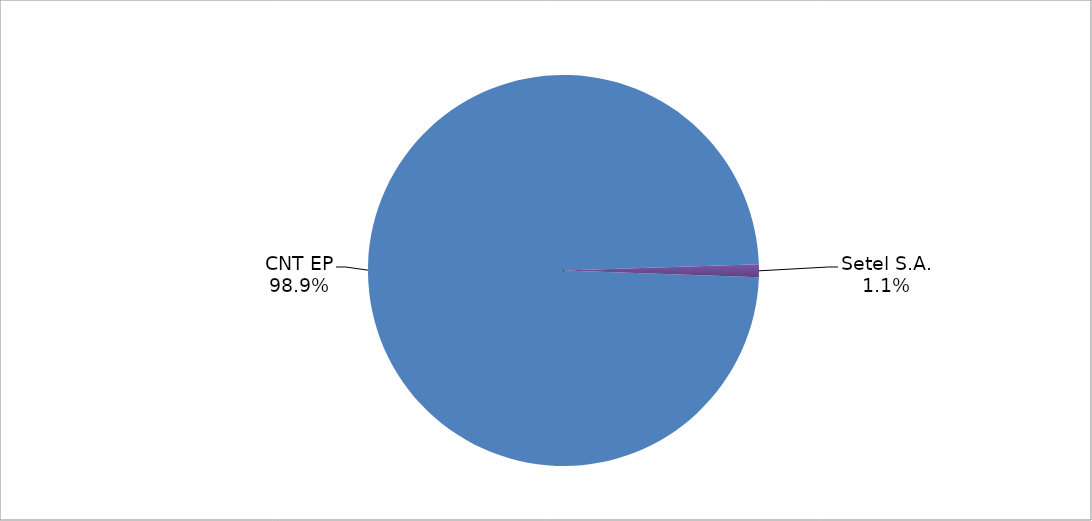
| Category | Series 0 |
|---|---|
| CNT EP | 280 |
| Setel S.A. | 3 |